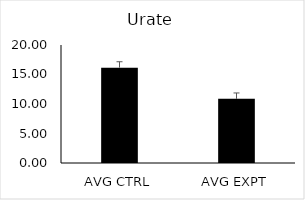
| Category | Series 0 |
|---|---|
| AVG CTRL | 16.163 |
| AVG EXPT | 10.871 |